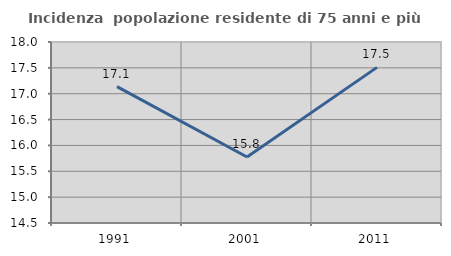
| Category | Incidenza  popolazione residente di 75 anni e più |
|---|---|
| 1991.0 | 17.136 |
| 2001.0 | 15.776 |
| 2011.0 | 17.509 |